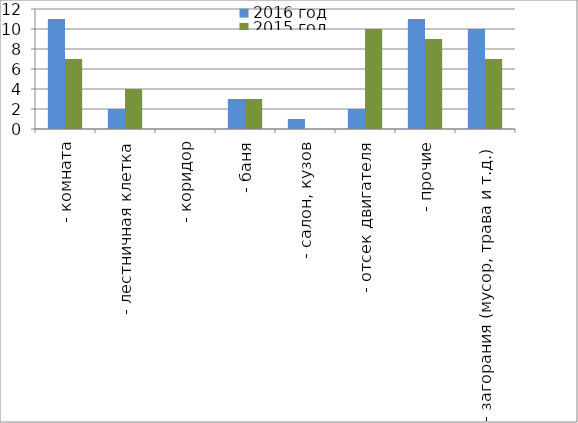
| Category | 2016 год | 2015 год |
|---|---|---|
|  - комната | 11 | 7 |
|  - лестничная клетка | 2 | 4 |
|  - коридор | 0 | 0 |
|  - баня | 3 | 3 |
|  - салон, кузов | 1 | 0 |
|  - отсек двигателя | 2 | 10 |
| - прочие | 11 | 9 |
| - загорания (мусор, трава и т.д.)  | 10 | 7 |